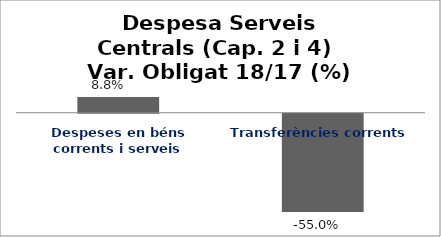
| Category | Series 0 |
|---|---|
| Despeses en béns corrents i serveis | 0.088 |
| Transferències corrents | -0.55 |